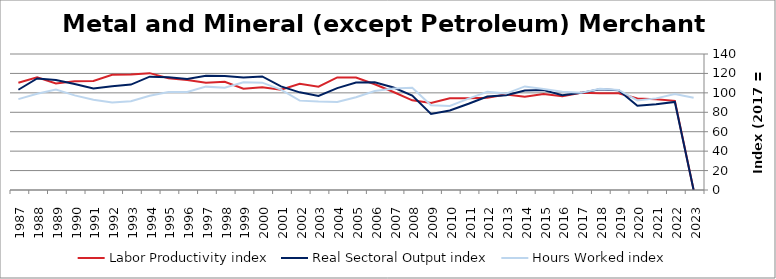
| Category | Labor Productivity index | Real Sectoral Output index | Hours Worked index |
|---|---|---|---|
| 2023.0 | 0 | 0 | 94.963 |
| 2022.0 | 91.785 | 90.633 | 98.745 |
| 2021.0 | 93.498 | 88.179 | 94.311 |
| 2020.0 | 94.114 | 86.807 | 92.236 |
| 2019.0 | 99.63 | 102.668 | 103.05 |
| 2018.0 | 99.628 | 103.762 | 104.149 |
| 2017.0 | 100 | 100 | 100 |
| 2016.0 | 96.45 | 97.649 | 101.243 |
| 2015.0 | 98.873 | 102.903 | 104.076 |
| 2014.0 | 96.08 | 102.453 | 106.632 |
| 2013.0 | 98.303 | 97.58 | 99.264 |
| 2012.0 | 95.077 | 96.168 | 101.147 |
| 2011.0 | 94.369 | 88.758 | 94.054 |
| 2010.0 | 94.539 | 81.841 | 86.568 |
| 2009.0 | 89.651 | 78.267 | 87.302 |
| 2008.0 | 92.335 | 97.288 | 105.363 |
| 2007.0 | 100.899 | 105.465 | 104.525 |
| 2006.0 | 108.873 | 110.991 | 101.945 |
| 2005.0 | 115.849 | 110.65 | 95.512 |
| 2004.0 | 115.86 | 104.902 | 90.542 |
| 2003.0 | 106.395 | 96.834 | 91.013 |
| 2002.0 | 109.262 | 100.52 | 92 |
| 2001.0 | 103.313 | 106.69 | 103.268 |
| 2000.0 | 105.796 | 116.877 | 110.473 |
| 1999.0 | 104.252 | 115.715 | 110.995 |
| 1998.0 | 111.462 | 117.264 | 105.205 |
| 1997.0 | 110.415 | 117.492 | 106.41 |
| 1996.0 | 113.187 | 114.227 | 100.919 |
| 1995.0 | 115.133 | 116.09 | 100.831 |
| 1994.0 | 120.284 | 116.665 | 96.991 |
| 1993.0 | 118.829 | 108.522 | 91.326 |
| 1992.0 | 118.575 | 106.694 | 89.98 |
| 1991.0 | 112.316 | 104.436 | 92.984 |
| 1990.0 | 112.062 | 109.173 | 97.422 |
| 1989.0 | 109.642 | 113.334 | 103.367 |
| 1988.0 | 116.031 | 114.869 | 98.999 |
| 1987.0 | 110.348 | 103.205 | 93.526 |